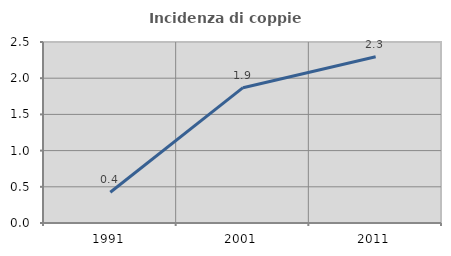
| Category | Incidenza di coppie miste |
|---|---|
| 1991.0 | 0.424 |
| 2001.0 | 1.869 |
| 2011.0 | 2.296 |